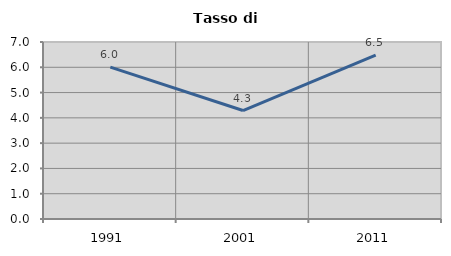
| Category | Tasso di disoccupazione   |
|---|---|
| 1991.0 | 6.004 |
| 2001.0 | 4.29 |
| 2011.0 | 6.481 |